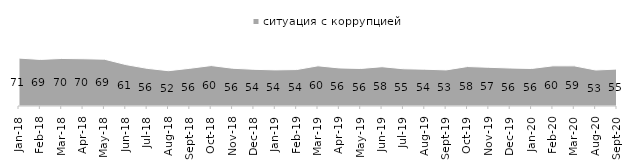
| Category | ситуация с коррупцией |
|---|---|
| 2018-01-01 | 70.95 |
| 2018-02-01 | 69 |
| 2018-03-01 | 70.4 |
| 2018-04-01 | 70 |
| 2018-05-01 | 69.35 |
| 2018-06-01 | 61.35 |
| 2018-07-01 | 55.75 |
| 2018-08-01 | 52.3 |
| 2018-09-01 | 55.85 |
| 2018-10-01 | 59.9 |
| 2018-11-01 | 55.938 |
| 2018-12-01 | 54.35 |
| 2019-01-01 | 53.5 |
| 2019-02-01 | 54 |
| 2019-03-01 | 59.523 |
| 2019-04-01 | 56.386 |
| 2019-05-01 | 55.622 |
| 2019-06-01 | 58.204 |
| 2019-07-01 | 55.149 |
| 2019-08-01 | 54.496 |
| 2019-09-01 | 53.465 |
| 2019-10-01 | 58.465 |
| 2019-11-01 | 57.327 |
| 2019-12-01 | 56.238 |
| 2020-01-01 | 55.594 |
| 2020-02-01 | 59.505 |
| 2020-03-01 | 59.445 |
| 2020-08-01 | 53.327 |
| 2020-09-01 | 54.704 |